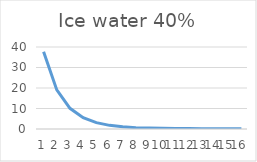
| Category | Series 0 |
|---|---|
| 0 | 37.7 |
| 1 | 19.07 |
| 2 | 10.09 |
| 3 | 5.534 |
| 4 | 3.091 |
| 5 | 1.783 |
| 6 | 1.063 |
| 7 | 0.662 |
| 8 | 0.44 |
| 9 | 0.312 |
| 10 | 0.241 |
| 11 | 0.199 |
| 12 | 0.177 |
| 13 | 0.163 |
| 14 | 0.158 |
| 15 | 0.153 |